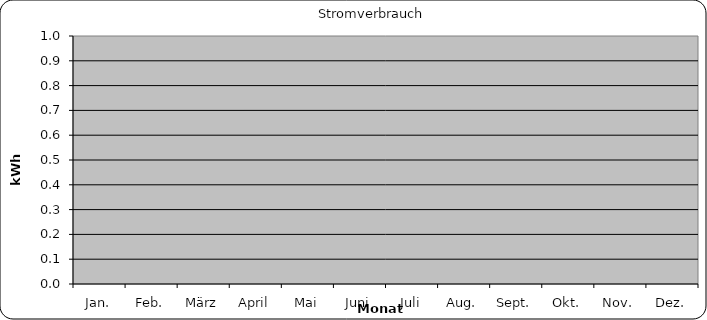
| Category | Stromverbrauch |
|---|---|
| Jan. | 0 |
| Feb. | 0 |
| März | 0 |
| April | 0 |
| Mai | 0 |
| Juni | 0 |
| Juli | 0 |
| Aug. | 0 |
| Sept. | 0 |
| Okt. | 0 |
| Nov. | 0 |
| Dez. | 0 |